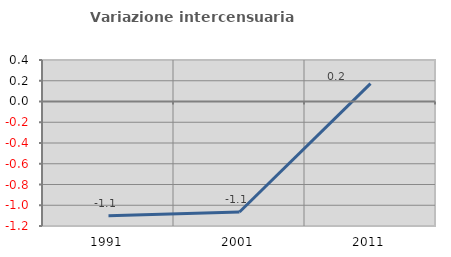
| Category | Variazione intercensuaria annua |
|---|---|
| 1991.0 | -1.101 |
| 2001.0 | -1.065 |
| 2011.0 | 0.172 |